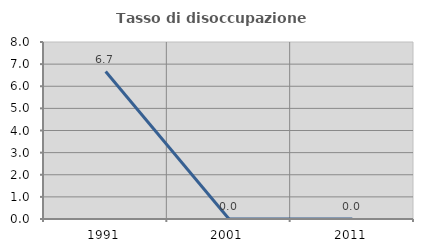
| Category | Tasso di disoccupazione giovanile  |
|---|---|
| 1991.0 | 6.667 |
| 2001.0 | 0 |
| 2011.0 | 0 |